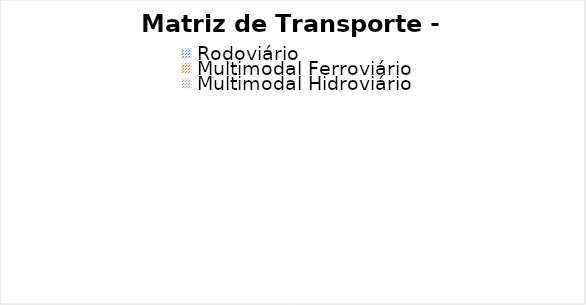
| Category | Matriz de Transporte - GO |
|---|---|
| Rodoviário | 0 |
| Multimodal Ferroviário | 0 |
| Multimodal Hidroviário | 0 |